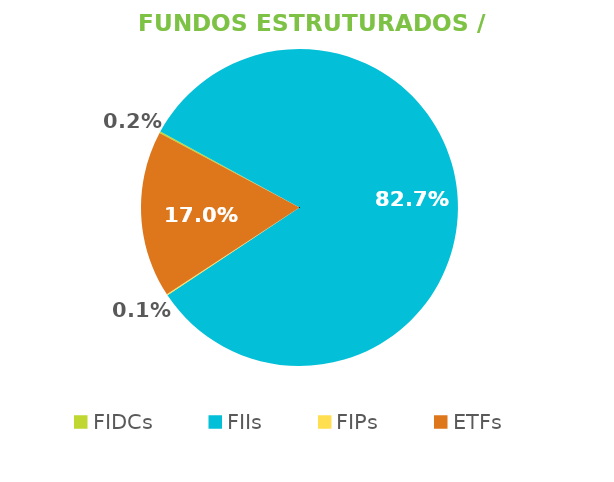
| Category | Fundos Estruturados / ETFs |
|---|---|
| FIDCs | 0.002 |
| FIIs | 0.827 |
| FIPs | 0.001 |
| ETFs | 0.17 |